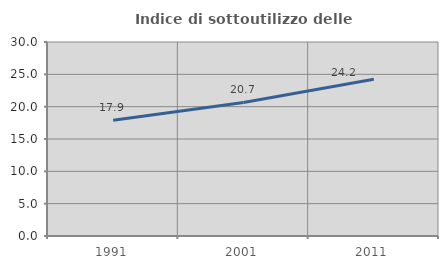
| Category | Indice di sottoutilizzo delle abitazioni  |
|---|---|
| 1991.0 | 17.893 |
| 2001.0 | 20.66 |
| 2011.0 | 24.242 |